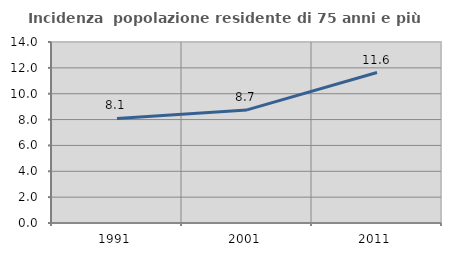
| Category | Incidenza  popolazione residente di 75 anni e più |
|---|---|
| 1991.0 | 8.087 |
| 2001.0 | 8.749 |
| 2011.0 | 11.636 |